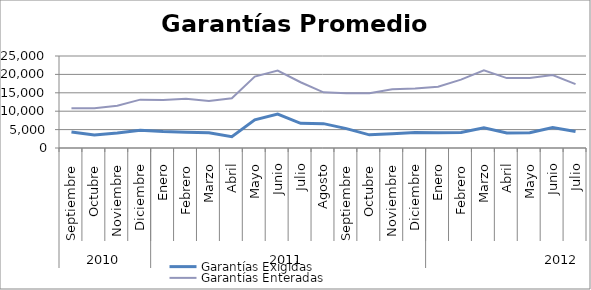
| Category | Garantías Exigidas | Garantías Enteradas |
|---|---|---|
| 0 | 4372.607 | 10829.062 |
| 1 | 3557.93 | 10787.9 |
| 2 | 4056.528 | 11463.422 |
| 3 | 4832.111 | 13142.881 |
| 4 | 4466.32 | 13061.162 |
| 5 | 4313.718 | 13357.444 |
| 6 | 4162.491 | 12796.251 |
| 7 | 3090.395 | 13495.263 |
| 8 | 7655.186 | 19416.342 |
| 9 | 9198.096 | 21035.301 |
| 10 | 6699.851 | 17866.843 |
| 11 | 6615.292 | 15119.839 |
| 12 | 5266.973 | 14911.639 |
| 13 | 3572.137 | 14861.465 |
| 14 | 3876.388 | 15976.819 |
| 15 | 4182.413 | 16147.351 |
| 16 | 4146.8 | 16662.483 |
| 17 | 4190.531 | 18572.749 |
| 18 | 5482.211 | 21128.648 |
| 19 | 4079.038 | 18997.51 |
| 20 | 4141.554 | 19005.364 |
| 21 | 5549.139 | 19818.91 |
| 22 | 4487.023 | 17351.39 |